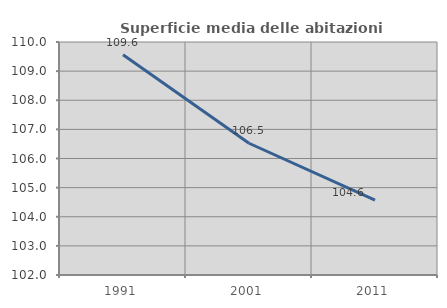
| Category | Superficie media delle abitazioni occupate |
|---|---|
| 1991.0 | 109.559 |
| 2001.0 | 106.524 |
| 2011.0 | 104.569 |